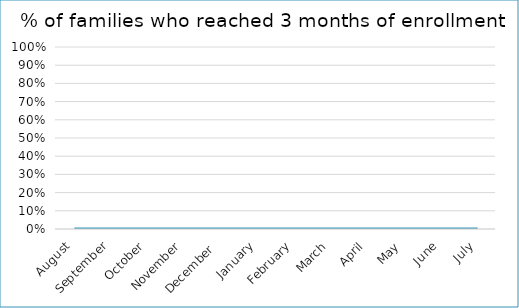
| Category | % of families who reached 3 months of enrollment |
|---|---|
| August | 0 |
| September | 0 |
| October | 0 |
| November | 0 |
| December  | 0 |
| January | 0 |
| February | 0 |
| March | 0 |
| April | 0 |
| May | 0 |
| June | 0 |
| July | 0 |